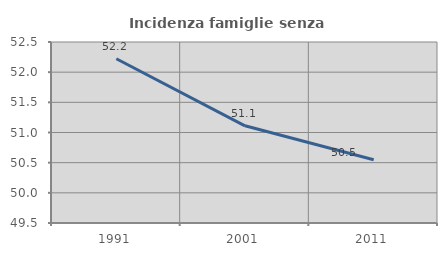
| Category | Incidenza famiglie senza nuclei |
|---|---|
| 1991.0 | 52.222 |
| 2001.0 | 51.111 |
| 2011.0 | 50.549 |